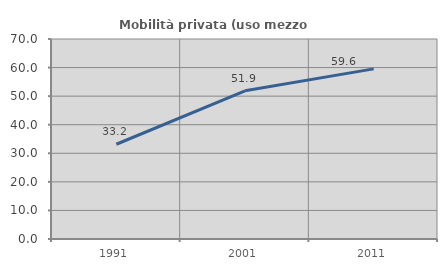
| Category | Mobilità privata (uso mezzo privato) |
|---|---|
| 1991.0 | 33.163 |
| 2001.0 | 51.852 |
| 2011.0 | 59.551 |